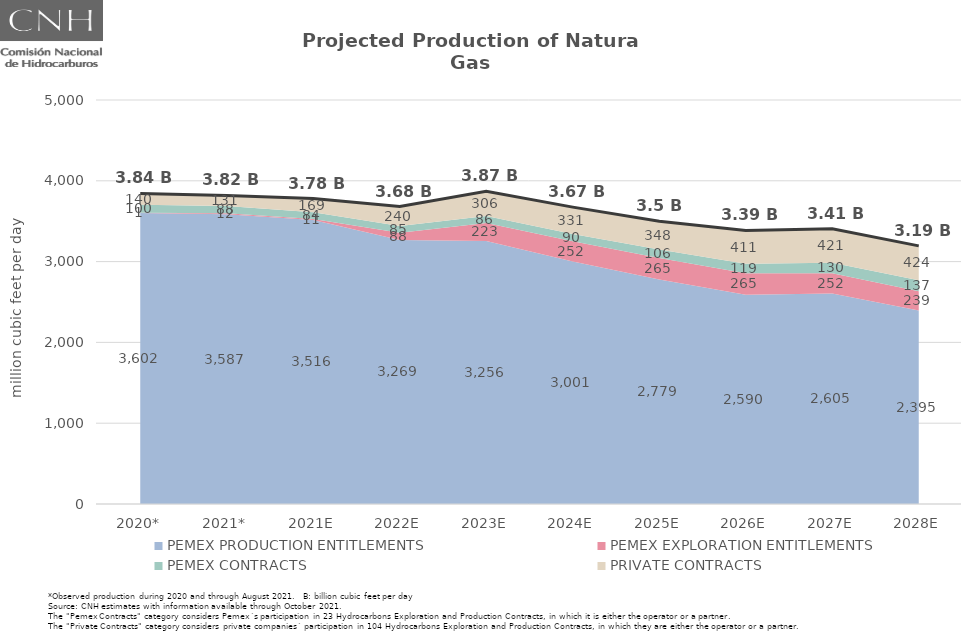
| Category | Total |
|---|---|
| 2020* | 3843.295 |
| 2021* | 3818.201 |
| 2021E | 3780.168 |
| 2022E | 3680.849 |
| 2023E | 3870.54 |
| 2024E | 3674.015 |
| 2025E | 3498.513 |
| 2026E | 3385.329 |
| 2027E | 3407.393 |
| 2028E | 3194.728 |